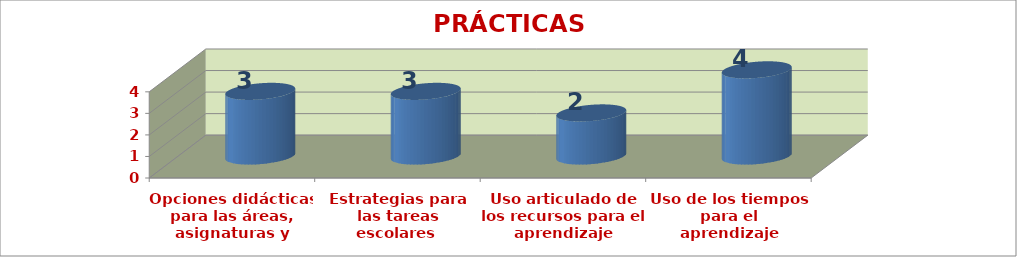
| Category | PRÁCTICAS PEDAGÓGICAS |
|---|---|
| Opciones didácticas para las áreas, asignaturas y proyectos transversales | 3 |
| Estrategias para las tareas
escolares  | 3 |
| Uso articulado de los recursos para el aprendizaje | 2 |
| Uso de los tiempos para el
aprendizaje | 4 |